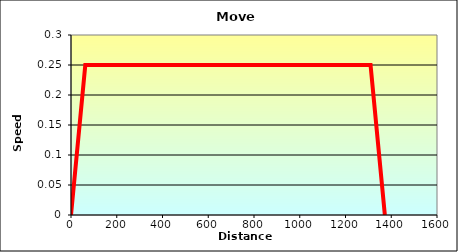
| Category | Series 0 |
|---|---|
| 0.0 | 0 |
| 62.5 | 0.25 |
| 1309.5 | 0.25 |
| 1372.0 | 0 |